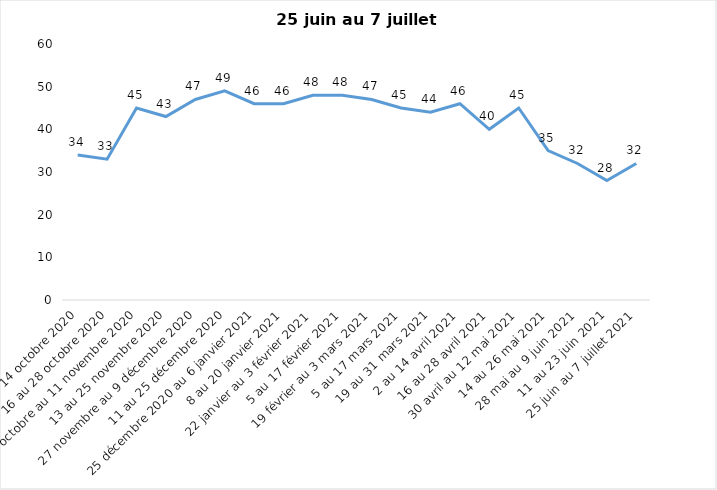
| Category | Toujours aux trois mesures |
|---|---|
| 2 au 14 octobre 2020 | 34 |
| 16 au 28 octobre 2020 | 33 |
| 30 octobre au 11 novembre 2020 | 45 |
| 13 au 25 novembre 2020 | 43 |
| 27 novembre au 9 décembre 2020 | 47 |
| 11 au 25 décembre 2020 | 49 |
| 25 décembre 2020 au 6 janvier 2021 | 46 |
| 8 au 20 janvier 2021 | 46 |
| 22 janvier au 3 février 2021 | 48 |
| 5 au 17 février 2021 | 48 |
| 19 février au 3 mars 2021 | 47 |
| 5 au 17 mars 2021 | 45 |
| 19 au 31 mars 2021 | 44 |
| 2 au 14 avril 2021 | 46 |
| 16 au 28 avril 2021 | 40 |
| 30 avril au 12 mai 2021 | 45 |
| 14 au 26 mai 2021 | 35 |
| 28 mai au 9 juin 2021 | 32 |
| 11 au 23 juin 2021 | 28 |
| 25 juin au 7 juillet 2021 | 32 |